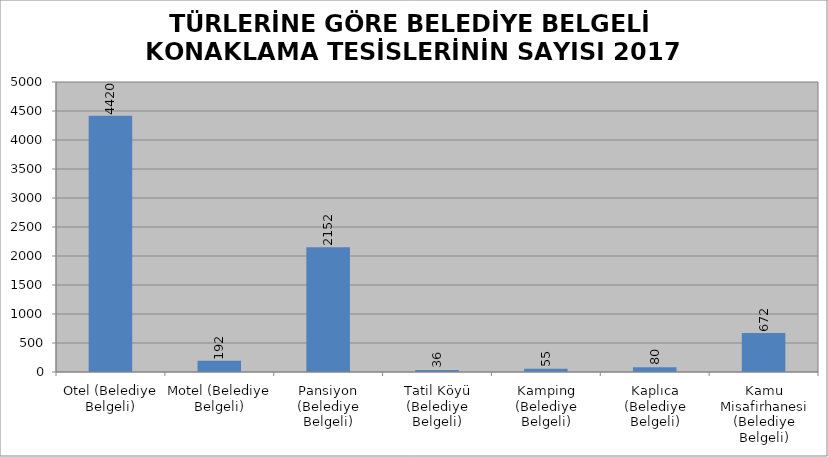
| Category | Series 0 |
|---|---|
| Otel (Belediye Belgeli) | 4420 |
| Motel (Belediye Belgeli) | 192 |
| Pansiyon (Belediye Belgeli) | 2152 |
| Tatil Köyü (Belediye Belgeli) | 36 |
| Kamping (Belediye Belgeli) | 55 |
| Kaplıca (Belediye Belgeli) | 80 |
| Kamu Misafirhanesi (Belediye Belgeli) | 672 |